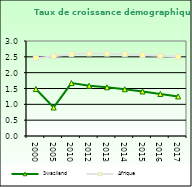
| Category | Swaziland | Afrique                        |
|---|---|---|
| 2000.0 | 1.485 | 2.458 |
| 2005.0 | 0.901 | 2.516 |
| 2010.0 | 1.672 | 2.59 |
| 2012.0 | 1.587 | 2.606 |
| 2013.0 | 1.538 | 2.601 |
| 2014.0 | 1.477 | 2.584 |
| 2015.0 | 1.407 | 2.559 |
| 2016.0 | 1.328 | 2.531 |
| 2017.0 | 1.249 | 2.503 |